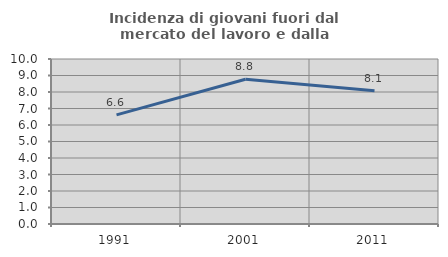
| Category | Incidenza di giovani fuori dal mercato del lavoro e dalla formazione  |
|---|---|
| 1991.0 | 6.612 |
| 2001.0 | 8.772 |
| 2011.0 | 8.081 |